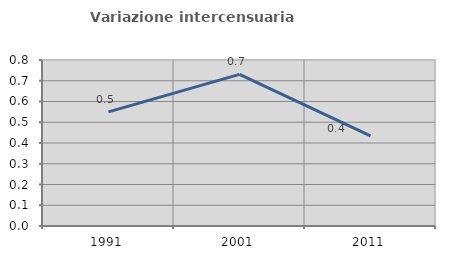
| Category | Variazione intercensuaria annua |
|---|---|
| 1991.0 | 0.55 |
| 2001.0 | 0.731 |
| 2011.0 | 0.434 |